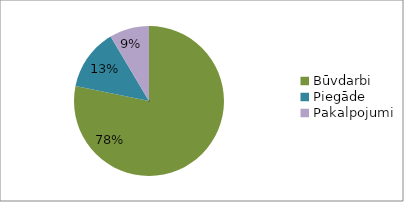
| Category | Series 0 |
|---|---|
| Būvdarbi | 0.782 |
| Piegāde | 0.132 |
| Pakalpojumi | 0.086 |